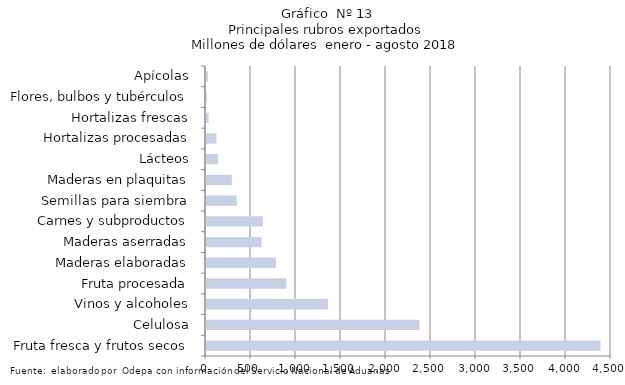
| Category | Series 7 |
|---|---|
| Fruta fresca y frutos secos | 4383930.113 |
| Celulosa | 2372487.009 |
| Vinos y alcoholes | 1357012.124 |
| Fruta procesada | 892723.873 |
| Maderas elaboradas | 777168.718 |
| Maderas aserradas | 617653.194 |
| Carnes y subproductos | 633972.109 |
| Semillas para siembra | 341328.306 |
| Maderas en plaquitas | 287355.795 |
| Lácteos | 134924.981 |
| Hortalizas procesadas | 116374.38 |
| Hortalizas frescas | 29268.609 |
| Flores, bulbos y tubérculos | 9943.749 |
| Apícolas | 21419.351 |